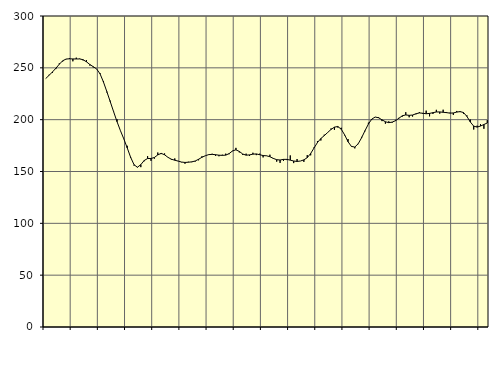
| Category | Piggar | Series 1 |
|---|---|---|
| nan | 239.7 | 239.65 |
| 87.0 | 243.3 | 242.8 |
| 87.0 | 245.1 | 246.07 |
| 87.0 | 248.8 | 249.6 |
| nan | 254.3 | 253.47 |
| 88.0 | 256.1 | 256.8 |
| 88.0 | 258.3 | 258.48 |
| 88.0 | 259.5 | 258.73 |
| nan | 256.3 | 258.58 |
| 89.0 | 259.8 | 258.54 |
| 89.0 | 258.9 | 258.57 |
| 89.0 | 257.2 | 257.83 |
| nan | 257.5 | 255.8 |
| 90.0 | 252.2 | 253.21 |
| 90.0 | 250.4 | 251.1 |
| 90.0 | 249 | 248.9 |
| nan | 244.9 | 244.19 |
| 91.0 | 237.2 | 236.37 |
| 91.0 | 226.3 | 227.07 |
| 91.0 | 218.3 | 217.39 |
| nan | 208 | 207.63 |
| 92.0 | 200.3 | 198.05 |
| 92.0 | 189.3 | 189.4 |
| 92.0 | 181.3 | 181.42 |
| nan | 174.8 | 172.77 |
| 93.0 | 163.1 | 163.76 |
| 93.0 | 155.7 | 156.57 |
| 93.0 | 154.4 | 154.07 |
| nan | 154.2 | 156.63 |
| 94.0 | 159.9 | 160.62 |
| 94.0 | 164.8 | 162.52 |
| 94.0 | 160.3 | 162.56 |
| nan | 162.4 | 163.52 |
| 95.0 | 168.3 | 166.03 |
| 95.0 | 166.8 | 167.49 |
| 95.0 | 167.4 | 166.12 |
| nan | 163.7 | 163.63 |
| 96.0 | 161.3 | 161.84 |
| 96.0 | 162.6 | 160.87 |
| 96.0 | 160.2 | 160.03 |
| nan | 158.9 | 159.11 |
| 97.0 | 157.5 | 158.73 |
| 97.0 | 159.4 | 158.95 |
| 97.0 | 159 | 159.32 |
| nan | 159.6 | 160.12 |
| 98.0 | 160.8 | 161.78 |
| 98.0 | 164.7 | 163.71 |
| 98.0 | 165.1 | 165.22 |
| nan | 166.5 | 166.29 |
| 99.0 | 167.1 | 166.52 |
| 99.0 | 165.1 | 166.19 |
| 99.0 | 164.7 | 165.73 |
| nan | 166.2 | 165.56 |
| 0.0 | 167.2 | 165.79 |
| 0.0 | 166.7 | 167.25 |
| 0.0 | 169.6 | 169.86 |
| nan | 172.8 | 170.91 |
| 1.0 | 168.4 | 169.36 |
| 1.0 | 166 | 166.88 |
| 1.0 | 167.2 | 165.74 |
| nan | 165 | 166.01 |
| 2.0 | 168.1 | 166.73 |
| 2.0 | 165.8 | 166.95 |
| 2.0 | 167.2 | 166.2 |
| nan | 163.6 | 165.4 |
| 3.0 | 165 | 165.14 |
| 3.0 | 166.2 | 164.27 |
| 3.0 | 162.2 | 162.65 |
| nan | 159.5 | 161.38 |
| 4.0 | 158.3 | 161.1 |
| 4.0 | 160.2 | 161.69 |
| 4.0 | 161 | 161.72 |
| nan | 165.5 | 160.95 |
| 5.0 | 158.1 | 160.13 |
| 5.0 | 162 | 159.7 |
| 5.0 | 160.1 | 160.11 |
| nan | 159.3 | 161.24 |
| 6.0 | 165.8 | 163.33 |
| 6.0 | 165.6 | 167.36 |
| 6.0 | 173.3 | 172.71 |
| nan | 179.3 | 177.95 |
| 7.0 | 179.9 | 181.82 |
| 7.0 | 185.5 | 184.58 |
| 7.0 | 187.5 | 187.61 |
| nan | 191.5 | 190.58 |
| 8.0 | 190.1 | 192.79 |
| 8.0 | 192.4 | 193.4 |
| 8.0 | 192.2 | 190.78 |
| nan | 184.9 | 185.36 |
| 9.0 | 181.3 | 178.74 |
| 9.0 | 173.9 | 174.18 |
| 9.0 | 172.3 | 173.58 |
| nan | 176.4 | 176.76 |
| 10.0 | 183.4 | 182.59 |
| 10.0 | 188.8 | 189.38 |
| 10.0 | 197.1 | 195.77 |
| nan | 200.1 | 200.58 |
| 11.0 | 202.6 | 202.54 |
| 11.0 | 202.4 | 201.81 |
| 11.0 | 198.6 | 199.88 |
| nan | 196.1 | 197.98 |
| 12.0 | 198.4 | 197.13 |
| 12.0 | 197.1 | 197.63 |
| 12.0 | 199.8 | 199.04 |
| nan | 201.8 | 201.42 |
| 13.0 | 203 | 203.8 |
| 13.0 | 207.2 | 204.55 |
| 13.0 | 202.3 | 204.16 |
| nan | 203 | 204.48 |
| 14.0 | 205.2 | 205.69 |
| 14.0 | 207.3 | 206.5 |
| 14.0 | 205.6 | 206.19 |
| nan | 208.7 | 205.7 |
| 15.0 | 203.2 | 206.05 |
| 15.0 | 205.5 | 206.76 |
| 15.0 | 209.5 | 207.41 |
| nan | 205.8 | 207.47 |
| 16.0 | 209.6 | 207.11 |
| 16.0 | 207.4 | 206.79 |
| 16.0 | 206.7 | 206.31 |
| nan | 204.6 | 206.49 |
| 17.0 | 208.4 | 207.3 |
| 17.0 | 207.3 | 207.79 |
| 17.0 | 205.7 | 206.85 |
| nan | 204.1 | 203.13 |
| 18.0 | 200.1 | 197.75 |
| 18.0 | 190.5 | 193.77 |
| 18.0 | 194.2 | 192.83 |
| nan | 195.7 | 193.86 |
| 19.0 | 191.2 | 195.31 |
| 19.0 | 199.5 | 196.83 |